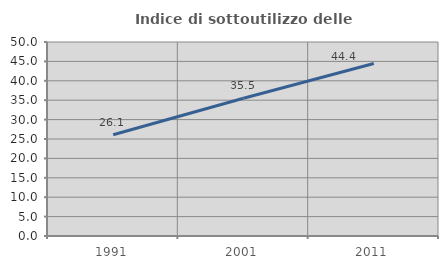
| Category | Indice di sottoutilizzo delle abitazioni  |
|---|---|
| 1991.0 | 26.083 |
| 2001.0 | 35.489 |
| 2011.0 | 44.444 |